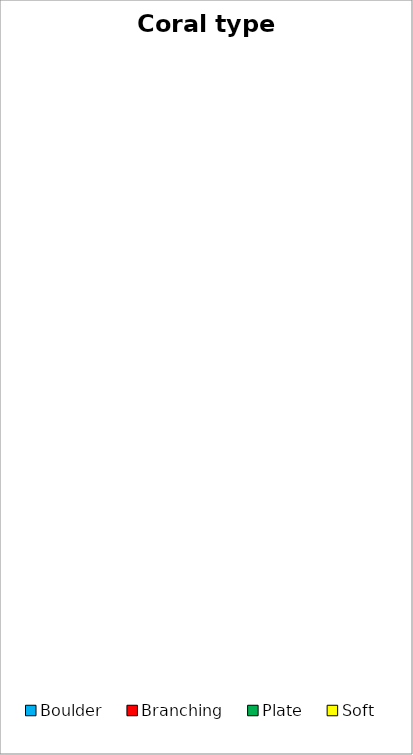
| Category | FREQUENCY Coral type |
|---|---|
| Boulder | 0 |
| Branching | 0 |
| Plate | 0 |
| Soft | 0 |